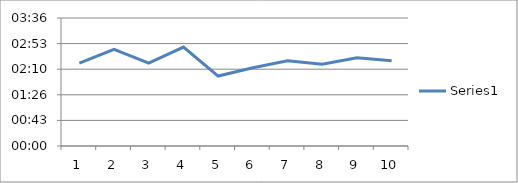
| Category | Series 0 |
|---|---|
| 0 | 0.002 |
| 1 | 0.002 |
| 2 | 0.002 |
| 3 | 0.002 |
| 4 | 0.001 |
| 5 | 0.002 |
| 6 | 0.002 |
| 7 | 0.002 |
| 8 | 0.002 |
| 9 | 0.002 |